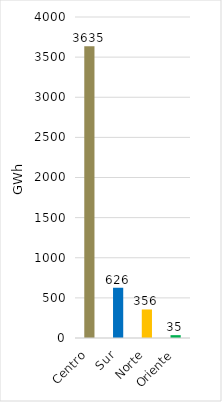
| Category | Series 0 |
|---|---|
| Centro | 3634.77 |
| Sur | 626.196 |
| Norte | 355.695 |
| Oriente | 35.401 |